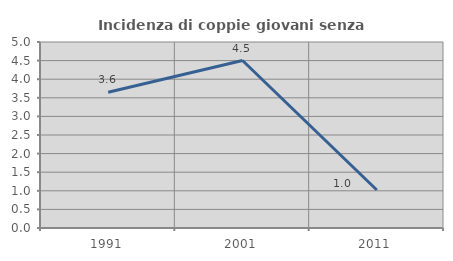
| Category | Incidenza di coppie giovani senza figli |
|---|---|
| 1991.0 | 3.65 |
| 2001.0 | 4.502 |
| 2011.0 | 1.02 |